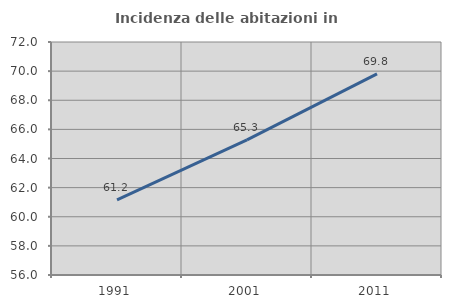
| Category | Incidenza delle abitazioni in proprietà  |
|---|---|
| 1991.0 | 61.159 |
| 2001.0 | 65.282 |
| 2011.0 | 69.816 |